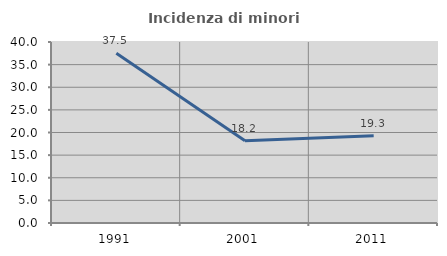
| Category | Incidenza di minori stranieri |
|---|---|
| 1991.0 | 37.5 |
| 2001.0 | 18.182 |
| 2011.0 | 19.277 |